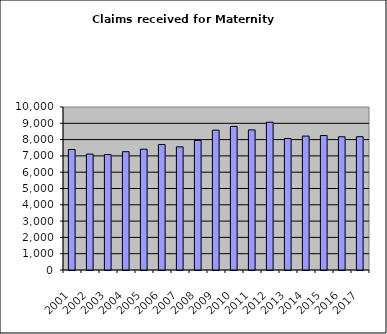
| Category | Series 1 |
|---|---|
| 2001.0 | 7392 |
| 2002.0 | 7111 |
| 2003.0 | 7083 |
| 2004.0 | 7258 |
| 2005.0 | 7413 |
| 2006.0 | 7697 |
| 2007.0 | 7554 |
| 2008.0 | 7952 |
| 2009.0 | 8579 |
| 2010.0 | 8808 |
| 2011.0 | 8595 |
| 2012.0 | 9067 |
| 2013.0 | 8067 |
| 2014.0 | 8216 |
| 2015.0 | 8250 |
| 2016.0 | 8173 |
| 2017.0 | 8179 |